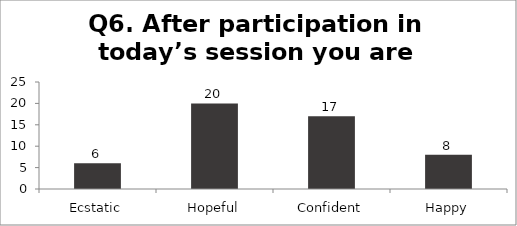
| Category | Q6. After participation in today’s session you are feeling? |
|---|---|
| Ecstatic | 6 |
| Hopeful | 20 |
| Confident | 17 |
| Happy | 8 |